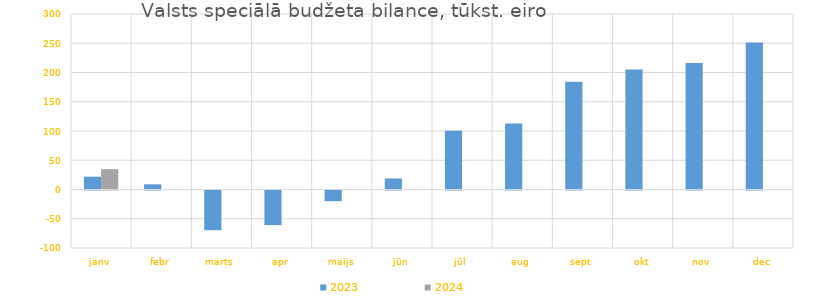
| Category | 2023 | 2024 |
|---|---|---|
| janv | 21850.373 | 34837.439 |
| febr | 8860.895 | 0 |
| marts | -67878.961 | 0 |
| apr | -59148.923 | 0 |
| maijs | -18273.46 | 0 |
| jūn | 18868.968 | 0 |
| jūl | 100483.566 | 0 |
| aug | 112828.993 | 0 |
| sept | 184000.505 | 0 |
| okt | 205121.199 | 0 |
| nov | 216425.067 | 0 |
| dec | 251412.782 | 0 |